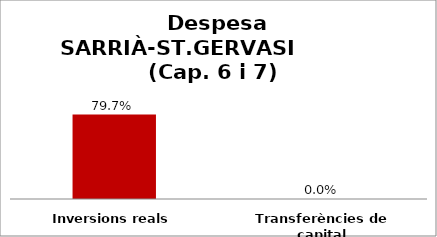
| Category | Series 0 |
|---|---|
| Inversions reals | 0.797 |
| Transferències de capital | 0 |